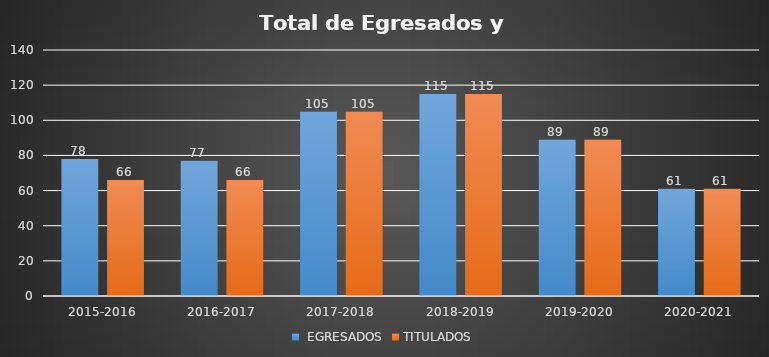
| Category |  EGRESADOS | TITULADOS |
|---|---|---|
| 2015-2016 | 78 | 66 |
| 2016-2017 | 77 | 66 |
| 2017-2018 | 105 | 105 |
| 2018-2019 | 115 | 115 |
| 2019-2020 | 89 | 89 |
| 2020-2021 | 61 | 61 |